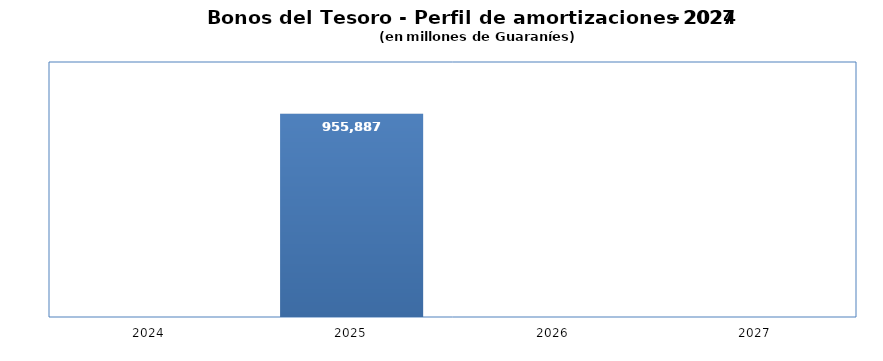
| Category | Series 0 |
|---|---|
| 2024.0 | 0 |
| 2025.0 | 955887 |
| 2026.0 | 0 |
| 2027.0 | 0 |